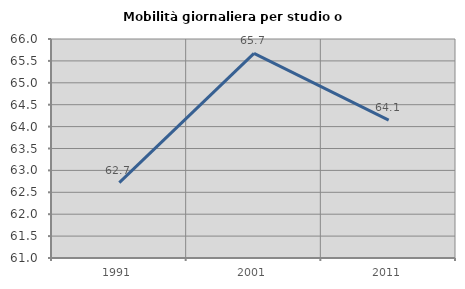
| Category | Mobilità giornaliera per studio o lavoro |
|---|---|
| 1991.0 | 62.72 |
| 2001.0 | 65.673 |
| 2011.0 | 64.148 |